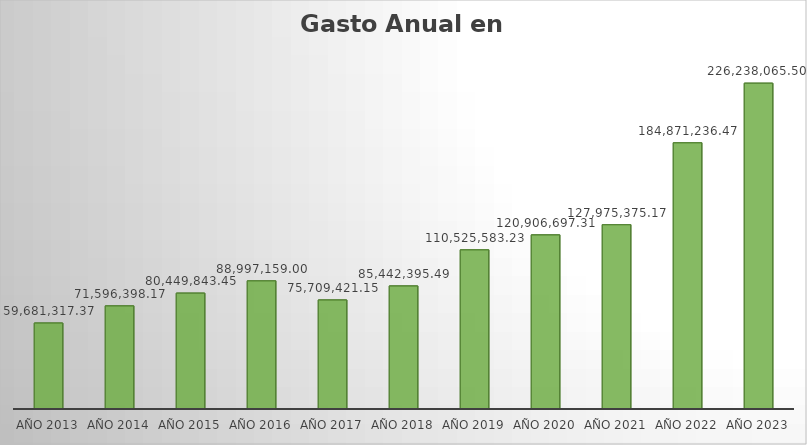
| Category | Monto |
|---|---|
| AÑO 2013 | 59681317.37 |
| AÑO 2014 | 71596398.17 |
| AÑO 2015 | 80449843.45 |
| AÑO 2016 | 88997159 |
| AÑO 2017 | 75709421.15 |
| AÑO 2018 | 85442395.49 |
| AÑO 2019 | 110525583.23 |
| AÑO 2020 | 120906697.31 |
| AÑO 2021 | 127975375.17 |
| AÑO 2022 | 184871236.47 |
| AÑO 2023 | 226238065.5 |